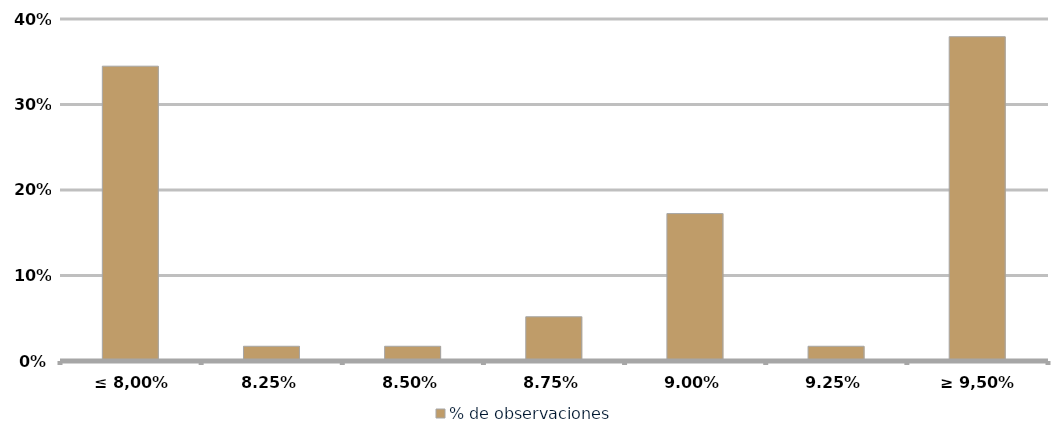
| Category | % de observaciones  |
|---|---|
| ≤ 8,00% | 0.345 |
| 8,25% | 0.017 |
| 8,50% | 0.017 |
| 8,75% | 0.052 |
| 9,00% | 0.172 |
| 9,25% | 0.017 |
| ≥ 9,50% | 0.379 |